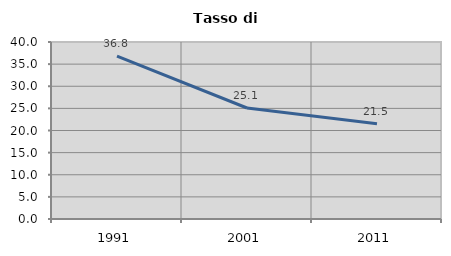
| Category | Tasso di disoccupazione   |
|---|---|
| 1991.0 | 36.817 |
| 2001.0 | 25.088 |
| 2011.0 | 21.502 |